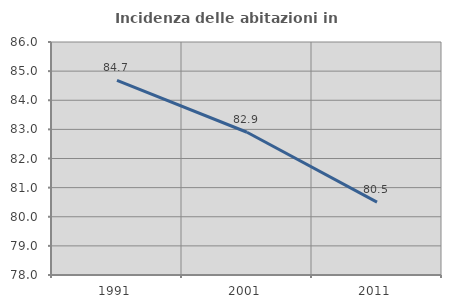
| Category | Incidenza delle abitazioni in proprietà  |
|---|---|
| 1991.0 | 84.684 |
| 2001.0 | 82.901 |
| 2011.0 | 80.501 |